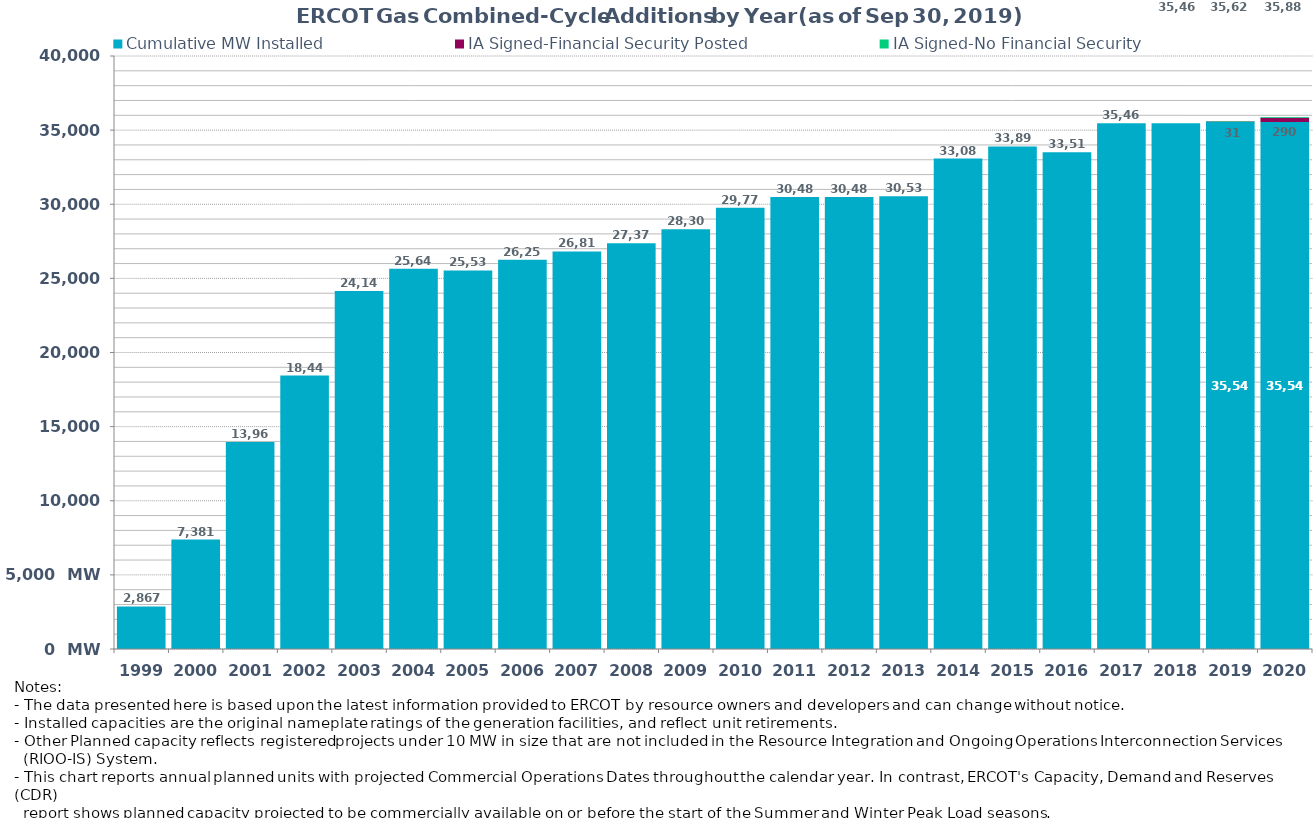
| Category | Cumulative MW Installed | IA Signed-Financial Security Posted  | IA Signed-No Financial Security  | Other Planned | Cumulative Installed and Planned |
|---|---|---|---|---|---|
| 1999.0 | 2867 | 0 | 0 | 0 | 2867 |
| 2000.0 | 7381 | 0 | 0 | 0 | 7381 |
| 2001.0 | 13967 | 0 | 0 | 0 | 13967 |
| 2002.0 | 18443 | 0 | 0 | 0 | 18443 |
| 2003.0 | 24141 | 0 | 0 | 0 | 24141 |
| 2004.0 | 25641 | 0 | 0 | 0 | 25641 |
| 2005.0 | 25539 | 0 | 0 | 0 | 25539 |
| 2006.0 | 26258 | 0 | 0 | 0 | 26258 |
| 2007.0 | 26815 | 0 | 0 | 0 | 26815 |
| 2008.0 | 27376 | 0 | 0 | 0 | 27376 |
| 2009.0 | 28309 | 0 | 0 | 0 | 28309 |
| 2010.0 | 29770 | 0 | 0 | 0 | 29770 |
| 2011.0 | 30488 | 0 | 0 | 0 | 30488 |
| 2012.0 | 30488 | 0 | 0 | 0 | 30488 |
| 2013.0 | 30538 | 0 | 0 | 0 | 30538 |
| 2014.0 | 33080 | 0 | 0 | 0 | 33080 |
| 2015.0 | 33897 | 0 | 0 | 0 | 33897 |
| 2016.0 | 33515 | 0 | 0 | 0 | 33515 |
| 2017.0 | 35465 | 0 | 0 | 0 | 35465 |
| 2018.0 | 35465 | 0 | 0 | 0 | 35465 |
| 2019.0 | 35545 | 31 | 45 | 0 | 35621 |
| 2020.0 | 35545 | 290 | 45 | 0 | 35880 |